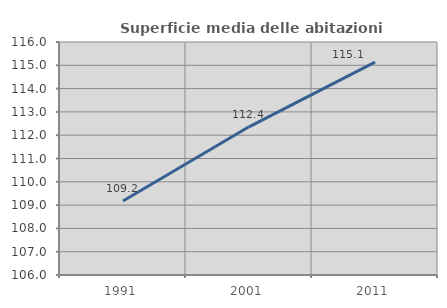
| Category | Superficie media delle abitazioni occupate |
|---|---|
| 1991.0 | 109.175 |
| 2001.0 | 112.36 |
| 2011.0 | 115.136 |